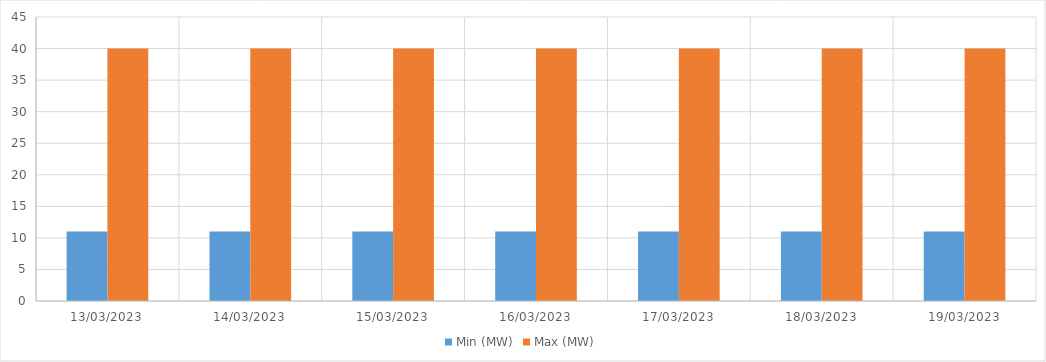
| Category | Min (MW) | Max (MW) |
|---|---|---|
| 13/03/2023 | 11 | 40 |
| 14/03/2023 | 11 | 40 |
| 15/03/2023 | 11 | 40 |
| 16/03/2023 | 11 | 40 |
| 17/03/2023 | 11 | 40 |
| 18/03/2023 | 11 | 40 |
| 19/03/2023 | 11 | 40 |